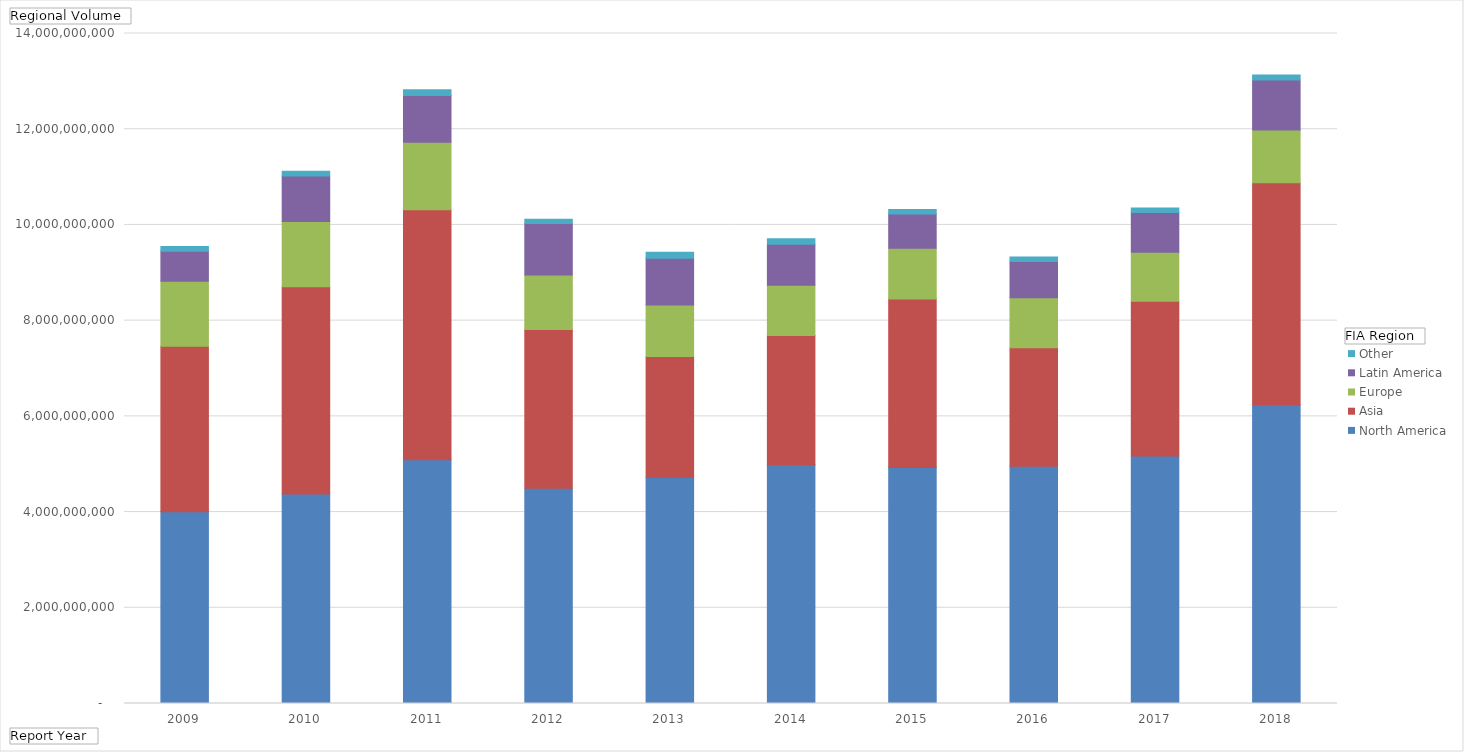
| Category | North America | Asia | Europe | Latin America | Other |
|---|---|---|---|---|---|
| 2009 | 4004778990 | 3460736213 | 1359708686 | 626122738 | 99919025 |
| 2010 | 4376684082 | 4332677531 | 1361077993 | 949771083 | 100591195 |
| 2011 | 5092129807 | 5227079911 | 1410810449 | 976645172 | 117527839 |
| 2012 | 4498454921 | 3317928263 | 1135809582 | 1079094270 | 86380007 |
| 2013 | 4726371175 | 2523073528 | 1077539146 | 978903015 | 124939773 |
| 2014 | 4991203088 | 2698948559 | 1047474223 | 857505416 | 117170726 |
| 2015 | 4931719130 | 3519902022 | 1061289440 | 713964379 | 96013115 |
| 2016 | 4957153359 | 2478283450 | 1041794954 | 759512771 | 91176153 |
| 2017 | 5169035337 | 3234826024 | 1023854853 | 831965760 | 96452756 |
| 2018 | 6239353097 | 4643151519 | 1100765168 | 1046502362 | 101405751 |